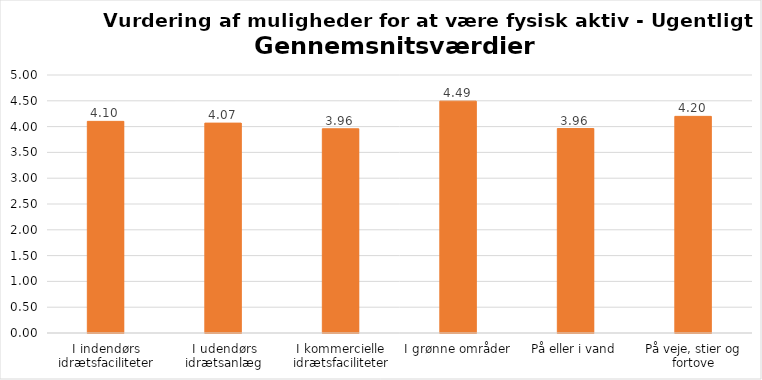
| Category | Gennemsnit |
|---|---|
| I indendørs idrætsfaciliteter | 4.101 |
| I udendørs idrætsanlæg | 4.068 |
| I kommercielle idrætsfaciliteter | 3.958 |
| I grønne områder | 4.494 |
| På eller i vand | 3.962 |
| På veje, stier og fortove | 4.198 |